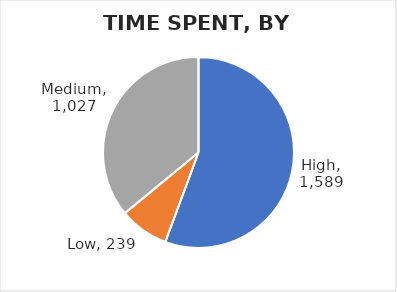
| Category | Total minutes |
|---|---|
| High | 1589 |
| Low | 239 |
| Medium | 1027 |